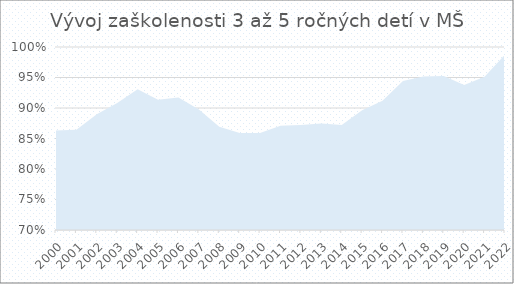
| Category | D/O3-5 |
|---|---|
| 2000.0 | 0.863 |
| 2001.0 | 0.864 |
| 2002.0 | 0.89 |
| 2003.0 | 0.908 |
| 2004.0 | 0.931 |
| 2005.0 | 0.914 |
| 2006.0 | 0.917 |
| 2007.0 | 0.898 |
| 2008.0 | 0.869 |
| 2009.0 | 0.859 |
| 2010.0 | 0.859 |
| 2011.0 | 0.871 |
| 2012.0 | 0.872 |
| 2013.0 | 0.875 |
| 2014.0 | 0.872 |
| 2015.0 | 0.896 |
| 2016.0 | 0.912 |
| 2017.0 | 0.944 |
| 2018.0 | 0.952 |
| 2019.0 | 0.952 |
| 2020.0 | 0.938 |
| 2021.0 | 0.951 |
| 2022.0 | 0.988 |